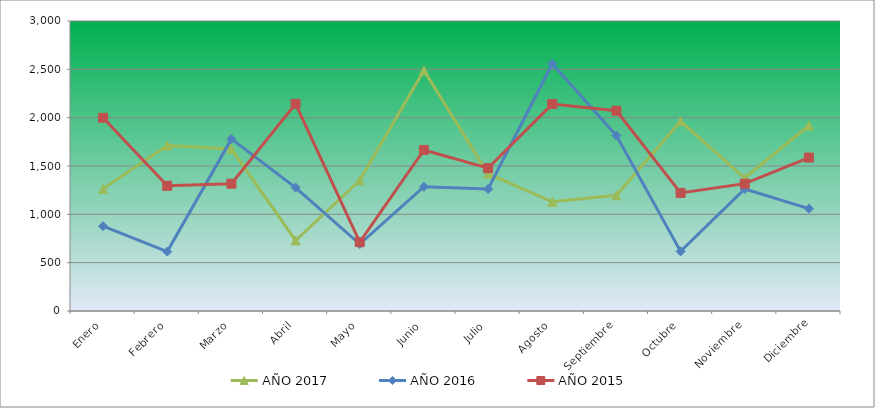
| Category | AÑO 2017 | AÑO 2016 | AÑO 2015 |
|---|---|---|---|
| Enero | 1263.876 | 877.684 | 1998.761 |
| Febrero | 1711.772 | 614.707 | 1295.494 |
| Marzo | 1675.542 | 1780.045 | 1317.085 |
| Abril | 729.629 | 1277.178 | 2143.063 |
| Mayo | 1352.409 | 691.957 | 712.521 |
| Junio | 2488.066 | 1285.297 | 1665.635 |
| Julio | 1420.366 | 1261.79 | 1477.48 |
| Agosto | 1129.551 | 2557.433 | 2140.649 |
| Septiembre | 1196.714 | 1815.366 | 2071.314 |
| Octubre | 1962.706 | 616.351 | 1221.465 |
| Noviembre | 1375.686 | 1261.79 | 1317.296 |
| Diciembre | 1918.751 | 1058.673 | 1587.132 |